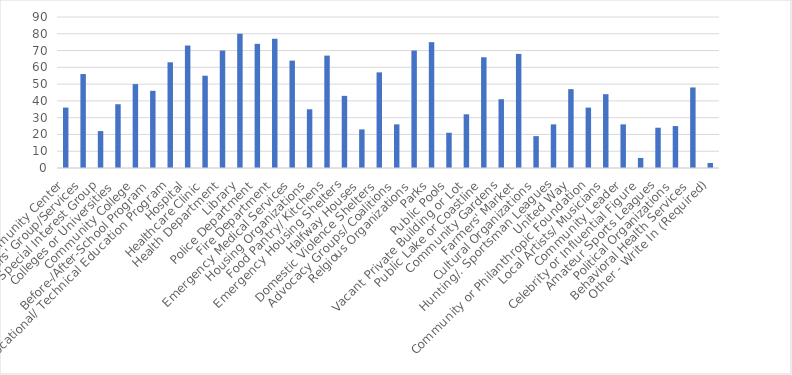
| Category | Number of Responses |
|---|---|
| Community Center | 36 |
| Seniors' Group/Services | 56 |
| Special Interest Group | 22 |
| Colleges or Universities | 38 |
| Community College | 50 |
| Before-/After-School Program | 46 |
| Vocational/ Technical Education Program | 63 |
| Hospital | 73 |
| Healthcare Clinic | 55 |
| Health Department | 70 |
| Library | 80 |
| Police Department | 74 |
| Fire Department | 77 |
| Emergency Medical Services | 64 |
| Housing Organizations | 35 |
| Food Pantry/ Kitchens | 67 |
| Emergency Housing Shelters | 43 |
| Halfway Houses | 23 |
| Domestic Violence Shelters | 57 |
| Advocacy Groups/ Coalitions | 26 |
| Relgious Organizations | 70 |
| Parks | 75 |
| Public Pools | 21 |
| Vacant Private Building or Lot | 32 |
| Public Lake or Coastline | 66 |
| Community Gardens | 41 |
| Farmers' Market | 68 |
| Cultural Organizations | 19 |
| Hunting/. Sportsman Leagues | 26 |
| United Way | 47 |
| Community or Philanthropic Foundation | 36 |
| Local Artists/ Musicians | 44 |
| Community Leader | 26 |
| Celebrity or Influential Figure | 6 |
| Amateur Sports Leagues | 24 |
| Political Organizations | 25 |
| Behavioral Health Services | 48 |
| Other - Write In (Required) | 3 |